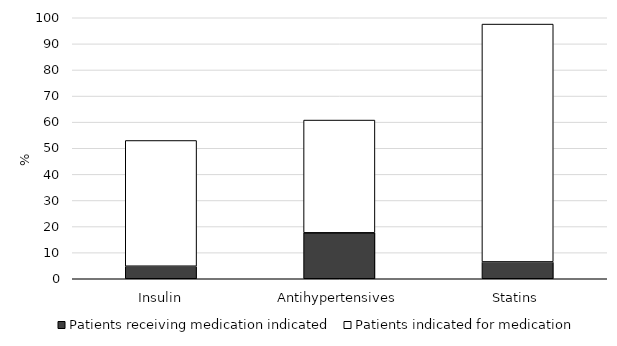
| Category | Patients receiving medication indicated | Patients indicated for medication |
|---|---|---|
| Insulin | 4.8 | 48.18 |
| Antihypertensives | 17.6 | 43.2 |
| Statins | 6.45 | 91.13 |